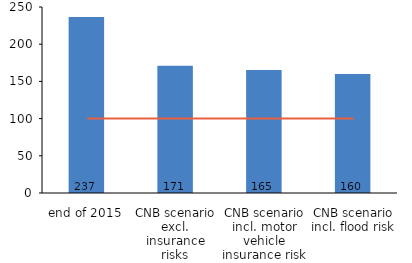
| Category | Series 0 |
|---|---|
| end of 2015 | 236.61 |
| CNB scenario excl. insurance risks | 170.95 |
| CNB scenario incl. motor vehicle insurance risk | 165.3 |
| CNB scenario incl. flood risk | 160.11 |